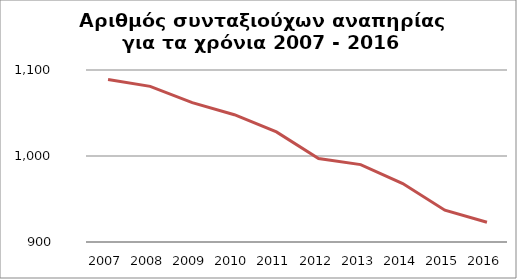
| Category | Series 1 |
|---|---|
| 2007.0 | 1089 |
| 2008.0 | 1081 |
| 2009.0 | 1062 |
| 2010.0 | 1048 |
| 2011.0 | 1028 |
| 2012.0 | 997 |
| 2013.0 | 990 |
| 2014.0 | 968 |
| 2015.0 | 937 |
| 2016.0 | 923 |